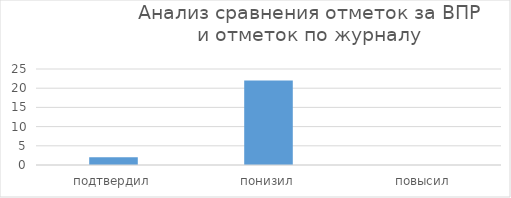
| Category | Series 0 |
|---|---|
| подтвердил | 2 |
| понизил | 22 |
| повысил | 0 |